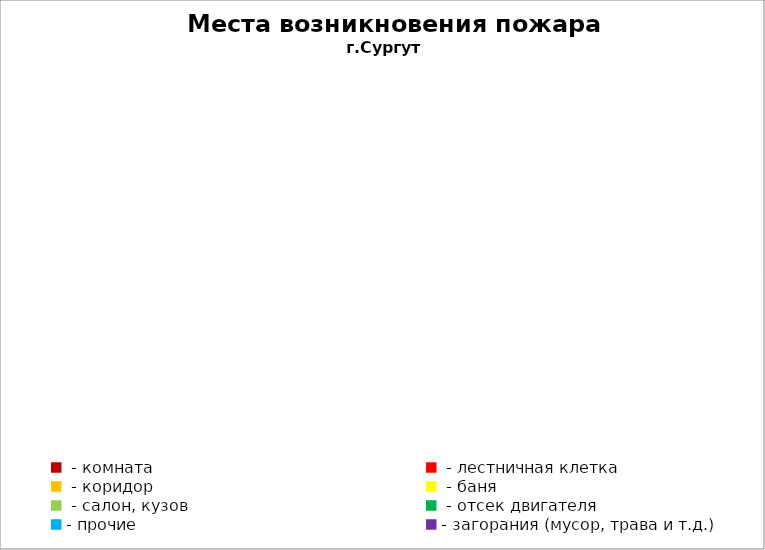
| Category | Места возникновения пожара |
|---|---|
|  - комната | 57 |
|  - лестничная клетка | 27 |
|  - коридор | 4 |
|  - баня | 43 |
|  - салон, кузов | 24 |
|  - отсек двигателя | 32 |
| - прочие | 96 |
| - загорания (мусор, трава и т.д.)  | 169 |